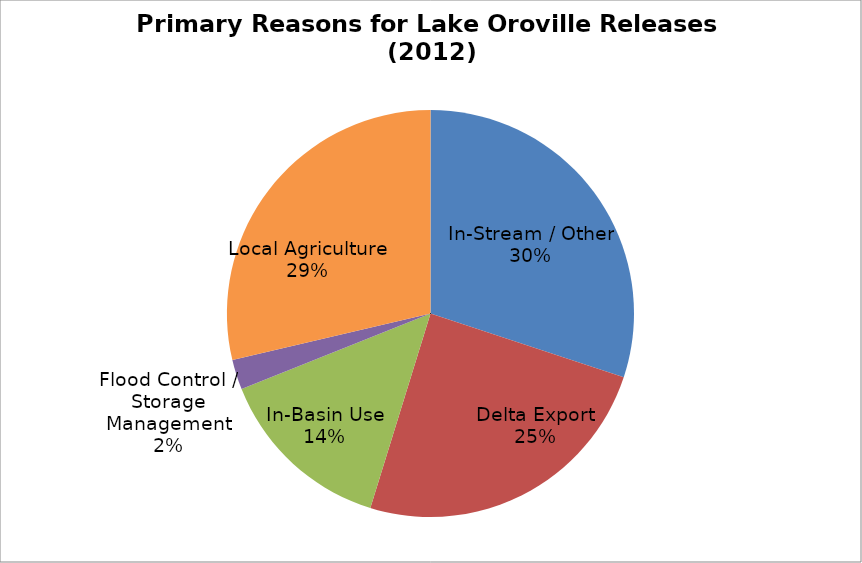
| Category | Series 1 |
|---|---|
| In-Stream / Other | 1042.444 |
| Delta Export | 855.996 |
| In-Basin Use | 490.899 |
| Flood Control / Storage Management | 82.56 |
| Local Agriculture | 993.795 |